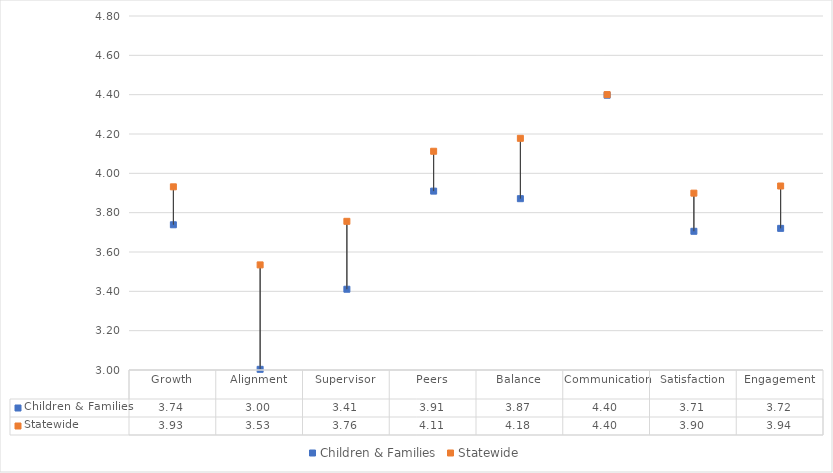
| Category | Children & Families | Statewide |
|---|---|---|
| Growth | 3.738 | 3.931 |
| Alignment | 3.003 | 3.534 |
| Supervisor | 3.411 | 3.756 |
| Peers | 3.91 | 4.112 |
| Balance | 3.871 | 4.178 |
| Communication | 4.397 | 4.4 |
| Satisfaction | 3.705 | 3.899 |
| Engagement | 3.72 | 3.936 |